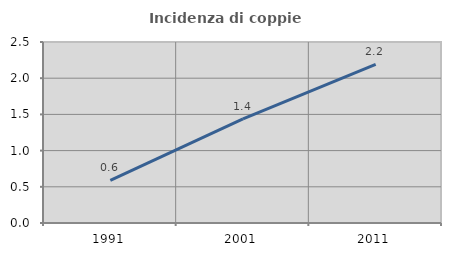
| Category | Incidenza di coppie miste |
|---|---|
| 1991.0 | 0.588 |
| 2001.0 | 1.437 |
| 2011.0 | 2.192 |